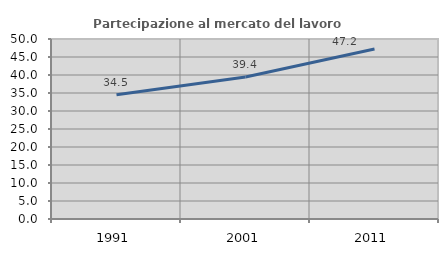
| Category | Partecipazione al mercato del lavoro  femminile |
|---|---|
| 1991.0 | 34.531 |
| 2001.0 | 39.439 |
| 2011.0 | 47.233 |